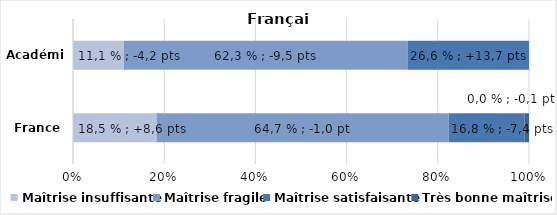
| Category | Maîtrise insuffisante | Maîtrise fragile | Maîtrise satisfaisante | Très bonne maîtrise |
|---|---|---|---|---|
| France | 18.491 | 64.736 | 16.758 | 1 |
| Académie | 11.111 | 62.335 | 26.554 | 0 |